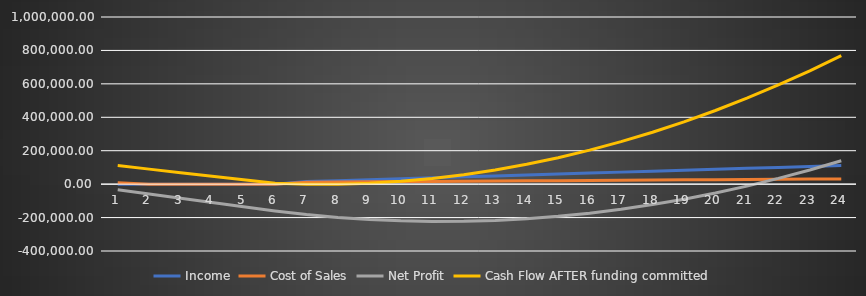
| Category | Income | Cost of Sales | Net Profit | Cash Flow AFTER funding committed |
|---|---|---|---|---|
| 0 | 0 | 8855 | -34072.299 | 110904.428 |
| 1 | 0 | 0 | -59289.599 | 89853.796 |
| 2 | 0 | 0 | -84506.898 | 68803.163 |
| 3 | 0 | 0 | -109724.197 | 47752.53 |
| 4 | 0 | 0 | -134941.496 | 26701.898 |
| 5 | 0 | 0 | -160158.796 | 5651.265 |
| 6 | 15400 | 11803.68 | -181779.775 | 0.633 |
| 7 | 21050 | 12950.66 | -198897.734 | 0 |
| 8 | 26700 | 14097.64 | -211512.673 | 5649.367 |
| 9 | 32350 | 15244.62 | -219624.593 | 16948.735 |
| 10 | 38000 | 16391.6 | -223233.492 | 33898.102 |
| 11 | 43650 | 17538.58 | -222339.371 | 56497.47 |
| 12 | 49300 | 18685.56 | -216942.231 | 84746.837 |
| 13 | 54950 | 19832.54 | -207042.07 | 118646.204 |
| 14 | 60600 | 20979.52 | -192638.889 | 158195.572 |
| 15 | 66250 | 22126.5 | -173732.688 | 203394.939 |
| 16 | 71900 | 23273.48 | -150323.468 | 254244.307 |
| 17 | 77550 | 24420.46 | -122411.227 | 310743.674 |
| 18 | 83200 | 25567.44 | -89995.966 | 372893.041 |
| 19 | 88850 | 26714.42 | -53077.686 | 440692.409 |
| 20 | 94500 | 27861.4 | -11656.385 | 514141.776 |
| 21 | 100150 | 29008.38 | 34267.936 | 593241.143 |
| 22 | 105800 | 30155.36 | 84695.277 | 677990.511 |
| 23 | 111450 | 31302.34 | 139625.637 | 768389.878 |